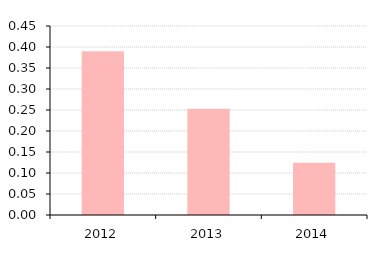
| Category | Debt to Asset Ratio |
|---|---|
| 2012.0 | 0.39 |
| 2013.0 | 0.253 |
| 2014.0 | 0.124 |